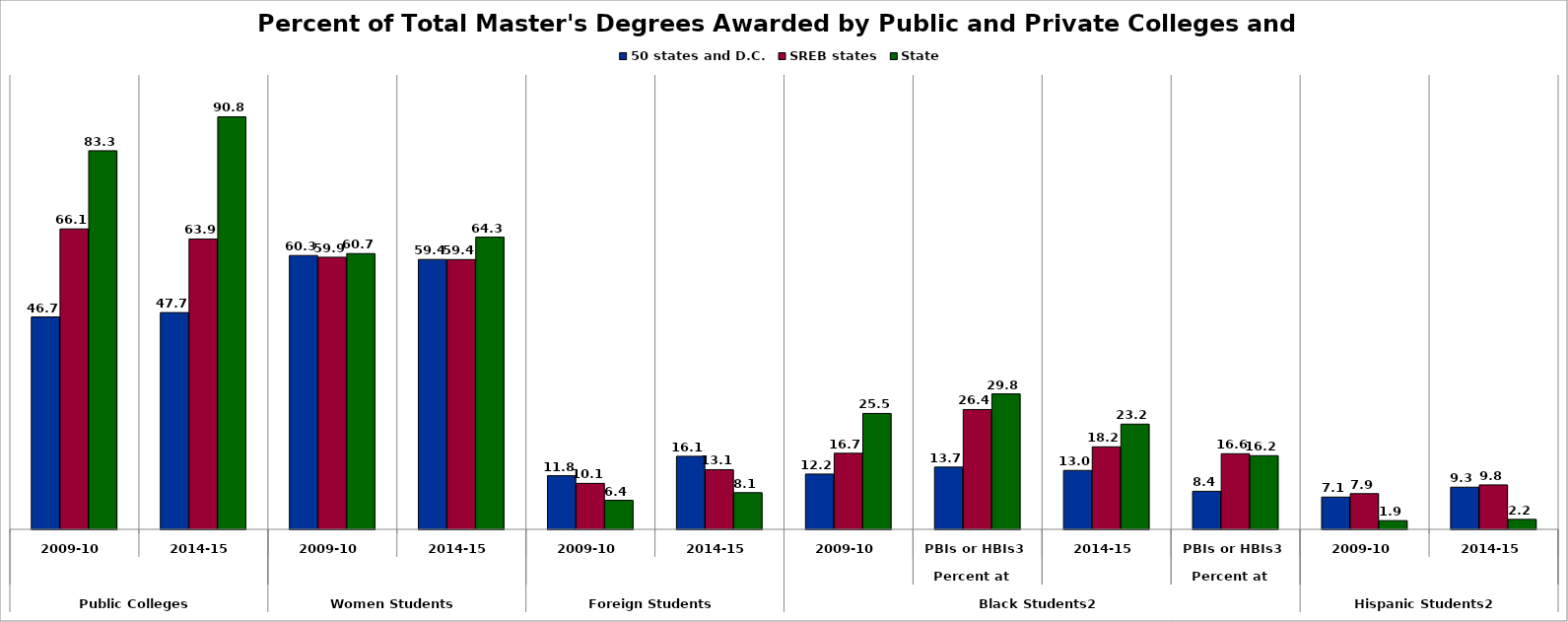
| Category | 50 states and D.C. | SREB states | State |
|---|---|---|---|
| 0 | 46.743 | 66.112 | 83.311 |
| 1 | 47.695 | 63.891 | 90.787 |
| 2 | 60.257 | 59.88 | 60.686 |
| 3 | 59.396 | 59.372 | 64.3 |
| 4 | 11.797 | 10.115 | 6.389 |
| 5 | 16.074 | 13.133 | 8.069 |
| 6 | 12.166 | 16.738 | 25.502 |
| 7 | 13.695 | 26.365 | 29.808 |
| 8 | 12.958 | 18.161 | 23.152 |
| 9 | 8.375 | 16.637 | 16.209 |
| 10 | 7.099 | 7.855 | 1.918 |
| 11 | 9.277 | 9.775 | 2.194 |